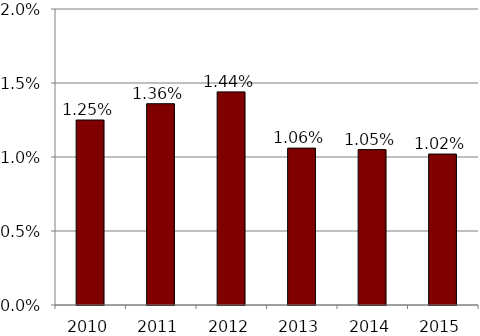
| Category | 75 year |
|---|---|
| 2010.0 | 0.012 |
| 2011.0 | 0.014 |
| 2012.0 | 0.014 |
| 2013.0 | 0.011 |
| 2014.0 | 0.011 |
| 2015.0 | 0.01 |